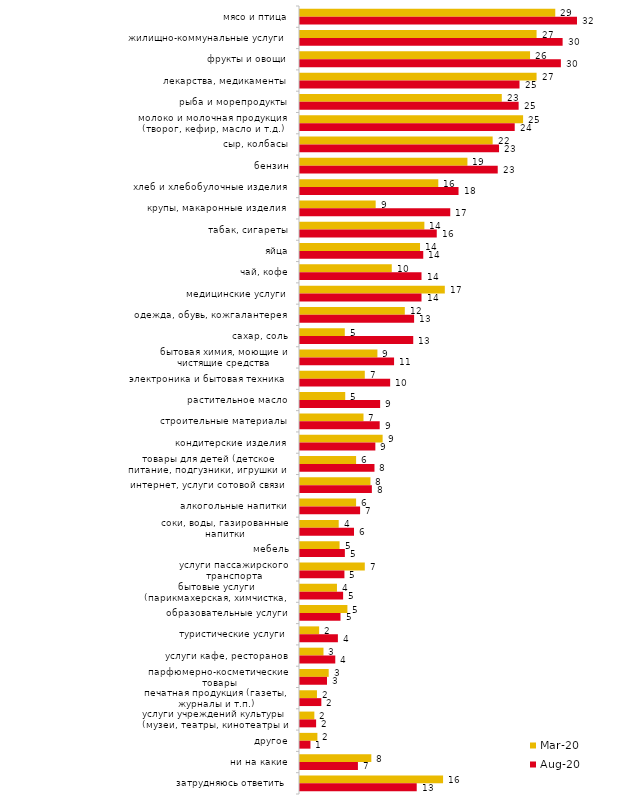
| Category | мар.20 | авг.20 |
|---|---|---|
| мясо и птица | 29.103 | 31.579 |
| жилищно-коммунальные услуги | 26.971 | 29.94 |
| фрукты и овощи | 26.227 | 29.742 |
| лекарства, медикаменты | 26.971 | 25.025 |
| рыба и морепродукты | 23.004 | 24.926 |
| молоко и молочная продукция (творог, кефир, масло и т.д.) | 25.434 | 24.479 |
| сыр, колбасы | 21.963 | 22.691 |
| бензин | 19.088 | 22.542 |
| хлеб и хлебобулочные изделия | 15.766 | 18.073 |
| крупы, макаронные изделия | 8.627 | 17.13 |
| табак, сигареты | 14.179 | 15.591 |
| яйца | 13.684 | 14.052 |
| чай, кофе | 10.461 | 13.853 |
| медицинские услуги | 16.51 | 13.853 |
| одежда, обувь, кожгалантерея | 11.948 | 13.009 |
| сахар, соль | 5.107 | 12.91 |
| бытовая химия, моющие и чистящие средства | 8.825 | 10.725 |
| электроника и бытовая техника | 7.387 | 10.278 |
| растительное масло | 5.156 | 9.136 |
| строительные материалы | 7.238 | 9.086 |
| кондитерские изделия | 9.42 | 8.59 |
| товары для детей (детское питание, подгузники, игрушки и т.п.) | 6.396 | 8.491 |
| интернет, услуги сотовой связи | 8.032 | 8.193 |
| алкогольные напитки | 6.396 | 6.852 |
| соки, воды, газированные напитки | 4.412 | 6.157 |
| мебель | 4.512 | 5.114 |
| услуги пассажирского транспорта | 7.387 | 5.065 |
| бытовые услуги (парикмахерская, химчистка, ателье и т.д.) | 4.214 | 4.916 |
| образовательные услуги | 5.404 | 4.618 |
| туристические услуги | 2.181 | 4.32 |
| услуги кафе, ресторанов | 2.677 | 4.022 |
| парфюмерно-косметические товары | 3.272 | 3.078 |
| печатная продукция (газеты, журналы и т.п.) | 1.934 | 2.433 |
| услуги учреждений культуры (музеи, театры, кинотеатры и т.п.) | 1.636 | 1.837 |
| другое | 1.983 | 1.192 |
| ни на какие | 8.131 | 6.604 |
| затрудняюсь ответить | 16.311 | 13.307 |